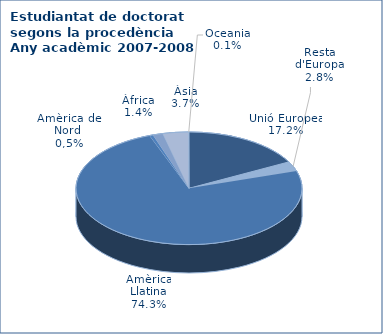
| Category | 2007-2008 |
|---|---|
| Unió Europea | 268 |
| Resta d'Europa | 44 |
| Amèrica Llatina | 1155 |
| Amèrica del Nord (1) | 8 |
| Àfrica | 22 |
| Àsia | 57 |
| Oceania | 1 |